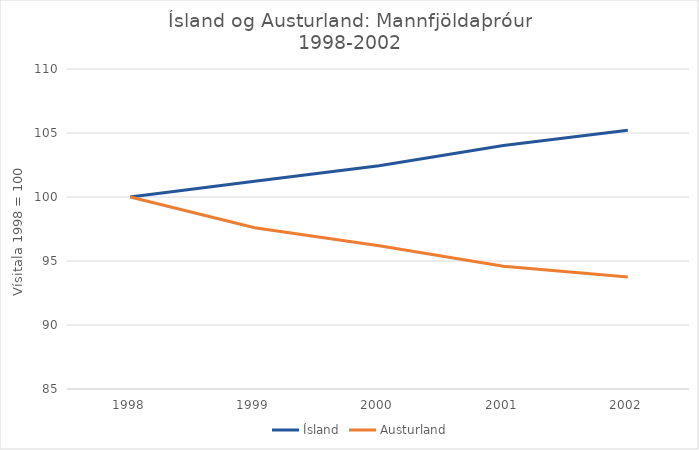
| Category | Ísland | Austurland |
|---|---|---|
| 1998.0 | 100 | 100 |
| 1999.0 | 101.223 | 97.597 |
| 2000.0 | 102.448 | 96.199 |
| 2001.0 | 104.031 | 94.591 |
| 2002.0 | 105.211 | 93.756 |